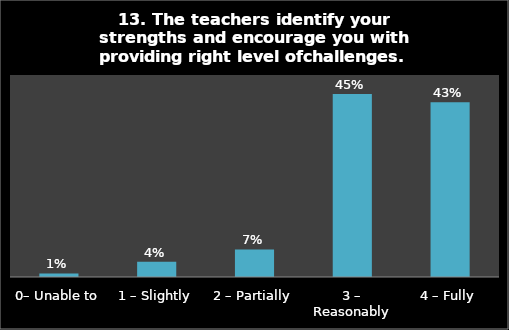
| Category | Series 0 |
|---|---|
| 0– Unable to | 0.009 |
| 1 – Slightly | 0.037 |
| 2 – Partially | 0.068 |
| 3 – Reasonably | 0.453 |
| 4 – Fully | 0.432 |